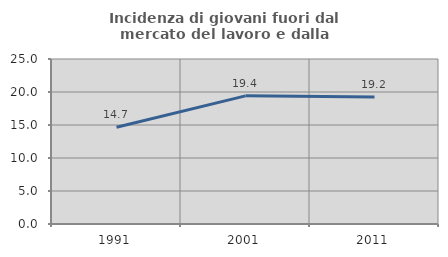
| Category | Incidenza di giovani fuori dal mercato del lavoro e dalla formazione  |
|---|---|
| 1991.0 | 14.667 |
| 2001.0 | 19.417 |
| 2011.0 | 19.231 |